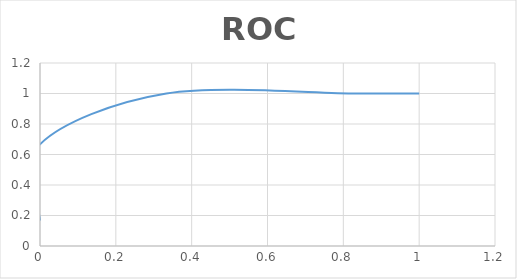
| Category | Series 0 |
|---|---|
| 1.0 | 1 |
| 0.8333333333333334 | 1 |
| 0.3333333333333333 | 1 |
| 0.0 | 0.667 |
| 0.0 | 0.167 |